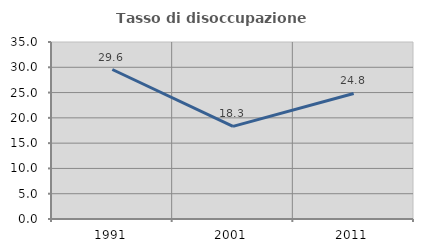
| Category | Tasso di disoccupazione giovanile  |
|---|---|
| 1991.0 | 29.559 |
| 2001.0 | 18.318 |
| 2011.0 | 24.822 |